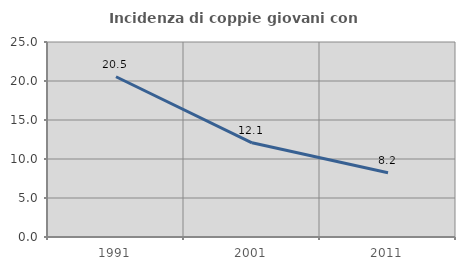
| Category | Incidenza di coppie giovani con figli |
|---|---|
| 1991.0 | 20.544 |
| 2001.0 | 12.073 |
| 2011.0 | 8.234 |